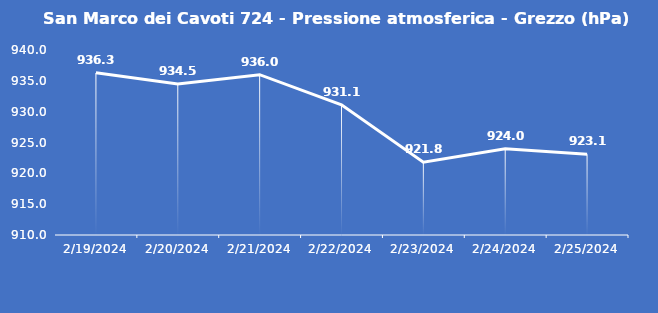
| Category | San Marco dei Cavoti 724 - Pressione atmosferica - Grezzo (hPa) |
|---|---|
| 2/19/24 | 936.3 |
| 2/20/24 | 934.5 |
| 2/21/24 | 936 |
| 2/22/24 | 931.1 |
| 2/23/24 | 921.8 |
| 2/24/24 | 924 |
| 2/25/24 | 923.1 |